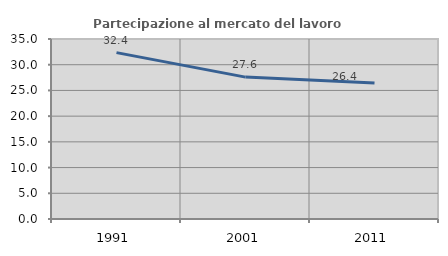
| Category | Partecipazione al mercato del lavoro  femminile |
|---|---|
| 1991.0 | 32.354 |
| 2001.0 | 27.59 |
| 2011.0 | 26.444 |